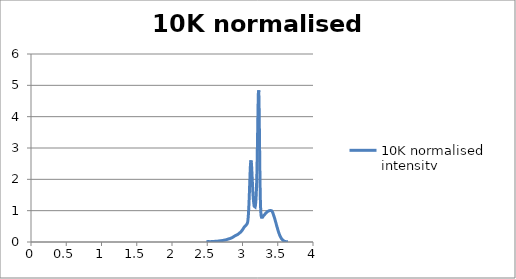
| Category | 10K normalised intensity |
|---|---|
| 3.64659 | 0.005 |
| 3.64391 | 0.005 |
| 3.64124 | 0.005 |
| 3.63857 | 0.005 |
| 3.6359 | 0.005 |
| 3.63324 | 0.005 |
| 3.63058 | 0.005 |
| 3.62792 | 0.005 |
| 3.62527 | 0.007 |
| 3.62262 | 0.007 |
| 3.61998 | 0.007 |
| 3.61734 | 0.012 |
| 3.6147 | 0.012 |
| 3.61207 | 0.012 |
| 3.60944 | 0.015 |
| 3.60681 | 0.015 |
| 3.60419 | 0.014 |
| 3.60157 | 0.017 |
| 3.59896 | 0.017 |
| 3.59635 | 0.026 |
| 3.59374 | 0.026 |
| 3.59114 | 0.026 |
| 3.58854 | 0.03 |
| 3.58595 | 0.035 |
| 3.58336 | 0.039 |
| 3.58077 | 0.039 |
| 3.57819 | 0.048 |
| 3.57561 | 0.05 |
| 3.57303 | 0.052 |
| 3.57046 | 0.061 |
| 3.56789 | 0.067 |
| 3.56533 | 0.072 |
| 3.56276 | 0.08 |
| 3.56021 | 0.084 |
| 3.55765 | 0.093 |
| 3.5551 | 0.102 |
| 3.55256 | 0.11 |
| 3.55001 | 0.12 |
| 3.54747 | 0.126 |
| 3.54494 | 0.137 |
| 3.54241 | 0.147 |
| 3.53988 | 0.153 |
| 3.53735 | 0.171 |
| 3.53483 | 0.183 |
| 3.53231 | 0.193 |
| 3.5298 | 0.206 |
| 3.52729 | 0.22 |
| 3.52478 | 0.236 |
| 3.52228 | 0.25 |
| 3.51978 | 0.264 |
| 3.51728 | 0.279 |
| 3.51479 | 0.295 |
| 3.5123 | 0.314 |
| 3.50981 | 0.329 |
| 3.50733 | 0.346 |
| 3.50485 | 0.361 |
| 3.50238 | 0.384 |
| 3.49991 | 0.403 |
| 3.49744 | 0.421 |
| 3.49497 | 0.442 |
| 3.49251 | 0.461 |
| 3.49005 | 0.479 |
| 3.4876 | 0.498 |
| 3.48515 | 0.517 |
| 3.4827 | 0.539 |
| 3.48026 | 0.555 |
| 3.47782 | 0.58 |
| 3.47538 | 0.6 |
| 3.47295 | 0.62 |
| 3.47052 | 0.637 |
| 3.46809 | 0.657 |
| 3.46567 | 0.675 |
| 3.46325 | 0.7 |
| 3.46083 | 0.717 |
| 3.45842 | 0.735 |
| 3.45601 | 0.755 |
| 3.4536 | 0.772 |
| 3.4512 | 0.79 |
| 3.4488 | 0.805 |
| 3.4464 | 0.824 |
| 3.44401 | 0.838 |
| 3.44162 | 0.854 |
| 3.43923 | 0.869 |
| 3.43685 | 0.885 |
| 3.43447 | 0.901 |
| 3.43209 | 0.919 |
| 3.42972 | 0.932 |
| 3.42734 | 0.943 |
| 3.42498 | 0.958 |
| 3.42261 | 0.964 |
| 3.42025 | 0.977 |
| 3.4179 | 0.982 |
| 3.41554 | 0.99 |
| 3.41319 | 0.997 |
| 3.41084 | 1.005 |
| 3.4085 | 1.001 |
| 3.40616 | 1.001 |
| 3.40382 | 1.004 |
| 3.40149 | 1.008 |
| 3.39916 | 1.009 |
| 3.39683 | 1.007 |
| 3.3945 | 1.008 |
| 3.39218 | 1 |
| 3.38986 | 1.003 |
| 3.38755 | 1.004 |
| 3.38523 | 1 |
| 3.38292 | 1 |
| 3.38062 | 1 |
| 3.37832 | 1.003 |
| 3.37602 | 0.996 |
| 3.37372 | 0.998 |
| 3.37143 | 0.997 |
| 3.36914 | 0.994 |
| 3.36685 | 0.994 |
| 3.36456 | 0.985 |
| 3.36228 | 0.987 |
| 3.36001 | 0.983 |
| 3.35773 | 0.98 |
| 3.35546 | 0.978 |
| 3.35319 | 0.976 |
| 3.35092 | 0.969 |
| 3.34866 | 0.965 |
| 3.3464 | 0.963 |
| 3.34415 | 0.958 |
| 3.34189 | 0.948 |
| 3.33964 | 0.944 |
| 3.33739 | 0.933 |
| 3.33515 | 0.931 |
| 3.33291 | 0.927 |
| 3.33067 | 0.921 |
| 3.32843 | 0.912 |
| 3.3262 | 0.912 |
| 3.32397 | 0.904 |
| 3.32175 | 0.896 |
| 3.31952 | 0.894 |
| 3.3173 | 0.887 |
| 3.31509 | 0.881 |
| 3.31287 | 0.873 |
| 3.31066 | 0.866 |
| 3.30845 | 0.863 |
| 3.30625 | 0.857 |
| 3.30404 | 0.853 |
| 3.30184 | 0.848 |
| 3.29965 | 0.84 |
| 3.29745 | 0.836 |
| 3.29526 | 0.827 |
| 3.29307 | 0.819 |
| 3.29089 | 0.812 |
| 3.28871 | 0.811 |
| 3.28653 | 0.799 |
| 3.28435 | 0.791 |
| 3.28218 | 0.786 |
| 3.28001 | 0.78 |
| 3.27784 | 0.78 |
| 3.27567 | 0.778 |
| 3.27351 | 0.779 |
| 3.27135 | 0.784 |
| 3.26919 | 0.792 |
| 3.26704 | 0.809 |
| 3.26489 | 0.832 |
| 3.26274 | 0.875 |
| 3.2606 | 0.933 |
| 3.25845 | 1.016 |
| 3.25632 | 1.136 |
| 3.25418 | 1.286 |
| 3.25204 | 1.491 |
| 3.24991 | 1.747 |
| 3.24779 | 2.046 |
| 3.24566 | 2.423 |
| 3.24354 | 2.788 |
| 3.24142 | 3.257 |
| 3.2393 | 3.649 |
| 3.23719 | 4.053 |
| 3.23507 | 4.399 |
| 3.23296 | 4.6 |
| 3.23086 | 4.839 |
| 3.22876 | 4.853 |
| 3.22665 | 4.843 |
| 3.22456 | 4.727 |
| 3.22246 | 4.483 |
| 3.22037 | 4.306 |
| 3.21828 | 3.984 |
| 3.21619 | 3.734 |
| 3.21411 | 3.414 |
| 3.21203 | 3.12 |
| 3.20995 | 2.858 |
| 3.20787 | 2.595 |
| 3.2058 | 2.362 |
| 3.20373 | 2.153 |
| 3.20166 | 1.963 |
| 3.19959 | 1.816 |
| 3.19753 | 1.663 |
| 3.19547 | 1.559 |
| 3.19341 | 1.456 |
| 3.19136 | 1.375 |
| 3.1893 | 1.311 |
| 3.18725 | 1.252 |
| 3.18521 | 1.213 |
| 3.18316 | 1.169 |
| 3.18112 | 1.142 |
| 3.17908 | 1.117 |
| 3.17705 | 1.098 |
| 3.17501 | 1.098 |
| 3.17298 | 1.093 |
| 3.17095 | 1.092 |
| 3.16893 | 1.11 |
| 3.1669 | 1.119 |
| 3.16488 | 1.143 |
| 3.16286 | 1.177 |
| 3.16085 | 1.203 |
| 3.15883 | 1.251 |
| 3.15682 | 1.286 |
| 3.15481 | 1.345 |
| 3.15281 | 1.396 |
| 3.15081 | 1.462 |
| 3.14881 | 1.535 |
| 3.14681 | 1.604 |
| 3.14481 | 1.703 |
| 3.14282 | 1.787 |
| 3.14083 | 1.881 |
| 3.13884 | 1.983 |
| 3.13686 | 2.067 |
| 3.13487 | 2.178 |
| 3.13289 | 2.256 |
| 3.13091 | 2.352 |
| 3.12894 | 2.43 |
| 3.12697 | 2.477 |
| 3.125 | 2.557 |
| 3.12303 | 2.559 |
| 3.12106 | 2.602 |
| 3.1191 | 2.587 |
| 3.11714 | 2.567 |
| 3.11518 | 2.538 |
| 3.11323 | 2.459 |
| 3.11127 | 2.403 |
| 3.10932 | 2.288 |
| 3.10737 | 2.178 |
| 3.10543 | 2.072 |
| 3.10348 | 1.925 |
| 3.10154 | 1.825 |
| 3.09961 | 1.684 |
| 3.09767 | 1.565 |
| 3.09574 | 1.451 |
| 3.0938 | 1.327 |
| 3.09188 | 1.234 |
| 3.08995 | 1.129 |
| 3.08802 | 1.04 |
| 3.0861 | 0.963 |
| 3.08418 | 0.887 |
| 3.08227 | 0.831 |
| 3.08035 | 0.773 |
| 3.07844 | 0.725 |
| 3.07653 | 0.695 |
| 3.07462 | 0.655 |
| 3.07272 | 0.639 |
| 3.07082 | 0.614 |
| 3.06892 | 0.601 |
| 3.06702 | 0.593 |
| 3.06512 | 0.58 |
| 3.06323 | 0.573 |
| 3.06134 | 0.565 |
| 3.05945 | 0.563 |
| 3.05756 | 0.557 |
| 3.05568 | 0.55 |
| 3.0538 | 0.546 |
| 3.05192 | 0.541 |
| 3.05004 | 0.534 |
| 3.04817 | 0.531 |
| 3.04629 | 0.529 |
| 3.04442 | 0.521 |
| 3.04256 | 0.516 |
| 3.04069 | 0.514 |
| 3.03883 | 0.508 |
| 3.03697 | 0.506 |
| 3.03511 | 0.501 |
| 3.03325 | 0.498 |
| 3.0314 | 0.499 |
| 3.02955 | 0.493 |
| 3.0277 | 0.485 |
| 3.02585 | 0.479 |
| 3.024 | 0.476 |
| 3.02216 | 0.47 |
| 3.02032 | 0.465 |
| 3.01848 | 0.456 |
| 3.01665 | 0.45 |
| 3.01481 | 0.443 |
| 3.01298 | 0.438 |
| 3.01115 | 0.43 |
| 3.00933 | 0.424 |
| 3.0075 | 0.417 |
| 3.00568 | 0.409 |
| 3.00386 | 0.402 |
| 3.00204 | 0.396 |
| 3.00022 | 0.391 |
| 2.99841 | 0.386 |
| 2.9966 | 0.381 |
| 2.99479 | 0.373 |
| 2.99298 | 0.366 |
| 2.99117 | 0.359 |
| 2.98937 | 0.355 |
| 2.98757 | 0.349 |
| 2.98577 | 0.344 |
| 2.98398 | 0.342 |
| 2.98218 | 0.337 |
| 2.98039 | 0.334 |
| 2.9786 | 0.326 |
| 2.97681 | 0.324 |
| 2.97503 | 0.321 |
| 2.97324 | 0.317 |
| 2.97146 | 0.314 |
| 2.96968 | 0.308 |
| 2.9679 | 0.304 |
| 2.96613 | 0.3 |
| 2.96436 | 0.3 |
| 2.96259 | 0.294 |
| 2.96082 | 0.29 |
| 2.95905 | 0.29 |
| 2.95729 | 0.284 |
| 2.95552 | 0.283 |
| 2.95376 | 0.279 |
| 2.952 | 0.276 |
| 2.95025 | 0.273 |
| 2.94849 | 0.27 |
| 2.94674 | 0.265 |
| 2.94499 | 0.262 |
| 2.94325 | 0.258 |
| 2.9415 | 0.256 |
| 2.93976 | 0.253 |
| 2.93801 | 0.25 |
| 2.93627 | 0.246 |
| 2.93454 | 0.244 |
| 2.9328 | 0.243 |
| 2.93107 | 0.238 |
| 2.92934 | 0.238 |
| 2.92761 | 0.236 |
| 2.92588 | 0.233 |
| 2.92416 | 0.23 |
| 2.92243 | 0.23 |
| 2.92071 | 0.228 |
| 2.91899 | 0.224 |
| 2.91728 | 0.222 |
| 2.91556 | 0.222 |
| 2.91385 | 0.22 |
| 2.91214 | 0.217 |
| 2.91043 | 0.216 |
| 2.90872 | 0.214 |
| 2.90702 | 0.211 |
| 2.90531 | 0.211 |
| 2.90361 | 0.208 |
| 2.90191 | 0.208 |
| 2.90022 | 0.206 |
| 2.89852 | 0.203 |
| 2.89683 | 0.202 |
| 2.89514 | 0.199 |
| 2.89345 | 0.199 |
| 2.89176 | 0.196 |
| 2.89007 | 0.194 |
| 2.88839 | 0.194 |
| 2.88671 | 0.188 |
| 2.88503 | 0.188 |
| 2.88335 | 0.185 |
| 2.88168 | 0.183 |
| 2.88 | 0.181 |
| 2.87833 | 0.177 |
| 2.87666 | 0.174 |
| 2.875 | 0.171 |
| 2.87333 | 0.169 |
| 2.87167 | 0.168 |
| 2.87 | 0.164 |
| 2.86834 | 0.162 |
| 2.86669 | 0.16 |
| 2.86503 | 0.156 |
| 2.86338 | 0.156 |
| 2.86172 | 0.151 |
| 2.86007 | 0.149 |
| 2.85843 | 0.148 |
| 2.85678 | 0.144 |
| 2.85513 | 0.144 |
| 2.85349 | 0.141 |
| 2.85185 | 0.138 |
| 2.85021 | 0.137 |
| 2.84857 | 0.134 |
| 2.84694 | 0.132 |
| 2.84531 | 0.13 |
| 2.84367 | 0.129 |
| 2.84204 | 0.127 |
| 2.84042 | 0.123 |
| 2.83879 | 0.123 |
| 2.83717 | 0.122 |
| 2.83554 | 0.118 |
| 2.83392 | 0.12 |
| 2.83231 | 0.118 |
| 2.83069 | 0.118 |
| 2.82907 | 0.115 |
| 2.82746 | 0.115 |
| 2.82585 | 0.111 |
| 2.82424 | 0.111 |
| 2.82263 | 0.11 |
| 2.82103 | 0.11 |
| 2.81942 | 0.108 |
| 2.81782 | 0.108 |
| 2.81622 | 0.105 |
| 2.81462 | 0.106 |
| 2.81303 | 0.104 |
| 2.81143 | 0.103 |
| 2.80984 | 0.103 |
| 2.80825 | 0.102 |
| 2.80666 | 0.102 |
| 2.80507 | 0.1 |
| 2.80349 | 0.099 |
| 2.8019 | 0.099 |
| 2.80032 | 0.097 |
| 2.79874 | 0.094 |
| 2.79716 | 0.094 |
| 2.79559 | 0.094 |
| 2.79401 | 0.092 |
| 2.79244 | 0.091 |
| 2.79087 | 0.091 |
| 2.7893 | 0.09 |
| 2.78773 | 0.087 |
| 2.78616 | 0.086 |
| 2.7846 | 0.085 |
| 2.78303 | 0.083 |
| 2.78147 | 0.083 |
| 2.77991 | 0.081 |
| 2.77836 | 0.08 |
| 2.7768 | 0.079 |
| 2.77525 | 0.078 |
| 2.7737 | 0.078 |
| 2.77215 | 0.074 |
| 2.7706 | 0.074 |
| 2.76905 | 0.074 |
| 2.7675 | 0.072 |
| 2.76596 | 0.071 |
| 2.76442 | 0.07 |
| 2.76288 | 0.067 |
| 2.76134 | 0.067 |
| 2.7598 | 0.067 |
| 2.75827 | 0.066 |
| 2.75674 | 0.065 |
| 2.7552 | 0.065 |
| 2.75367 | 0.064 |
| 2.75215 | 0.061 |
| 2.75062 | 0.061 |
| 2.7491 | 0.06 |
| 2.74757 | 0.059 |
| 2.74605 | 0.059 |
| 2.74453 | 0.059 |
| 2.74301 | 0.058 |
| 2.7415 | 0.058 |
| 2.73998 | 0.058 |
| 2.73847 | 0.055 |
| 2.73696 | 0.058 |
| 2.73545 | 0.054 |
| 2.73394 | 0.054 |
| 2.73243 | 0.053 |
| 2.73093 | 0.053 |
| 2.72943 | 0.052 |
| 2.72793 | 0.049 |
| 2.72643 | 0.052 |
| 2.72493 | 0.052 |
| 2.72343 | 0.05 |
| 2.72194 | 0.048 |
| 2.72044 | 0.048 |
| 2.71895 | 0.048 |
| 2.71746 | 0.048 |
| 2.71597 | 0.047 |
| 2.71449 | 0.047 |
| 2.713 | 0.046 |
| 2.71152 | 0.046 |
| 2.71004 | 0.046 |
| 2.70856 | 0.046 |
| 2.70708 | 0.043 |
| 2.7056 | 0.043 |
| 2.70413 | 0.042 |
| 2.70265 | 0.042 |
| 2.70118 | 0.044 |
| 2.69971 | 0.042 |
| 2.69824 | 0.042 |
| 2.69677 | 0.041 |
| 2.69531 | 0.041 |
| 2.69384 | 0.04 |
| 2.69238 | 0.04 |
| 2.69092 | 0.04 |
| 2.68946 | 0.04 |
| 2.688 | 0.04 |
| 2.68655 | 0.037 |
| 2.68509 | 0.04 |
| 2.68364 | 0.037 |
| 2.68219 | 0.037 |
| 2.68074 | 0.037 |
| 2.67929 | 0.036 |
| 2.67784 | 0.036 |
| 2.6764 | 0.035 |
| 2.67496 | 0.035 |
| 2.67351 | 0.035 |
| 2.67207 | 0.035 |
| 2.67063 | 0.033 |
| 2.6692 | 0.031 |
| 2.66776 | 0.033 |
| 2.66633 | 0.033 |
| 2.66489 | 0.031 |
| 2.66346 | 0.031 |
| 2.66203 | 0.029 |
| 2.66061 | 0.031 |
| 2.65918 | 0.029 |
| 2.65775 | 0.029 |
| 2.65633 | 0.029 |
| 2.65491 | 0.03 |
| 2.65349 | 0.03 |
| 2.65207 | 0.028 |
| 2.65065 | 0.03 |
| 2.64924 | 0.028 |
| 2.64782 | 0.028 |
| 2.64641 | 0.028 |
| 2.645 | 0.027 |
| 2.64359 | 0.027 |
| 2.64218 | 0.028 |
| 2.64077 | 0.027 |
| 2.63937 | 0.024 |
| 2.63796 | 0.024 |
| 2.63656 | 0.024 |
| 2.63516 | 0.023 |
| 2.63376 | 0.024 |
| 2.63236 | 0.024 |
| 2.63096 | 0.024 |
| 2.62957 | 0.024 |
| 2.62818 | 0.024 |
| 2.62678 | 0.023 |
| 2.62539 | 0.022 |
| 2.624 | 0.023 |
| 2.62262 | 0.022 |
| 2.62123 | 0.023 |
| 2.61985 | 0.022 |
| 2.61846 | 0.022 |
| 2.61708 | 0.022 |
| 2.6157 | 0.022 |
| 2.61432 | 0.022 |
| 2.61294 | 0.022 |
| 2.61157 | 0.022 |
| 2.61019 | 0.02 |
| 2.60882 | 0.02 |
| 2.60745 | 0.02 |
| 2.60608 | 0.021 |
| 2.60471 | 0.021 |
| 2.60334 | 0.021 |
| 2.60198 | 0.021 |
| 2.60061 | 0.021 |
| 2.59925 | 0.021 |
| 2.59789 | 0.021 |
| 2.59653 | 0.018 |
| 2.59517 | 0.021 |
| 2.59381 | 0.021 |
| 2.59246 | 0.018 |
| 2.5911 | 0.018 |
| 2.58975 | 0.018 |
| 2.5884 | 0.018 |
| 2.58705 | 0.021 |
| 2.5857 | 0.017 |
| 2.58435 | 0.018 |
| 2.583 | 0.018 |
| 2.58166 | 0.017 |
| 2.58032 | 0.018 |
| 2.57897 | 0.015 |
| 2.57763 | 0.018 |
| 2.5763 | 0.017 |
| 2.57496 | 0.017 |
| 2.57362 | 0.017 |
| 2.57229 | 0.014 |
| 2.57095 | 0.018 |
| 2.56962 | 0.017 |
| 2.56829 | 0.014 |
| 2.56696 | 0.017 |
| 2.56563 | 0.011 |
| 2.56431 | 0.018 |
| 2.56298 | 0.011 |
| 2.56166 | 0.018 |
| 2.56033 | 0.014 |
| 2.55901 | 0.017 |
| 2.55769 | 0.007 |
| 2.55638 | 0.014 |
| 2.55506 | 0.011 |
| 2.55374 | 0.014 |
| 2.55243 | 0.011 |
| 2.55112 | 0.018 |
| 2.5498 | 0.008 |
| 2.54849 | 0.01 |
| 2.54718 | 0.007 |
| 2.54588 | 0.01 |
| 2.54457 | 0.008 |
| 2.54327 | 0.014 |
| 2.54196 | 0.011 |
| 2.54066 | 0.018 |
| 2.53936 | 0.021 |
| 2.53806 | 0.021 |
| 2.53676 | 0.016 |
| 2.53546 | 0.008 |
| 2.53417 | 0.004 |
| 2.53287 | 0.011 |
| 2.53158 | 0.017 |
| 2.53029 | 0.021 |
| 2.529 | 0.01 |
| 2.52771 | 0.01 |
| 2.52642 | 0.007 |
| 2.52514 | 0.014 |
| 2.52385 | 0.017 |
| 2.52257 | 0.019 |
| 2.52129 | 0.019 |
| 2.52 | 0.009 |
| 2.51872 | 0.01 |
| 2.51745 | 0.017 |
| 2.51617 | 0.016 |
| 2.51489 | 0.014 |
| 2.51362 | 0.014 |
| 2.51234 | 0.009 |
| 2.51107 | 0.009 |
| 2.5098 | 0.016 |
| 2.50853 | 0.014 |
| 2.50726 | 0.01 |
| 2.506 | 0.01 |
| 2.50473 | 0.019 |
| 2.50347 | 0.016 |
| 2.5022 | 0.01 |
| 2.50094 | 0.014 |
| 2.49968 | 0.012 |
| 2.49842 | 0.01 |
| 2.49716 | 0.012 |
| 2.49591 | 0.01 |
| 2.49465 | 0.016 |
| 2.4934 | 0.012 |
| 2.49214 | 0.01 |
| 2.49089 | 0.009 |
| 2.48964 | 0.009 |
| 2.48839 | 0.01 |
| 2.48715 | 0.016 |
| 2.4859 | 0.012 |
| 2.48465 | 0.01 |
| 2.48341 | 0.01 |
| 2.48217 | 0.018 |
| 2.48092 | 0.012 |
| 2.47968 | 0.015 |